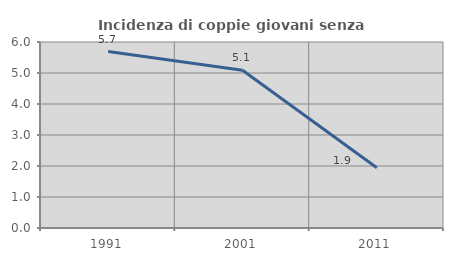
| Category | Incidenza di coppie giovani senza figli |
|---|---|
| 1991.0 | 5.691 |
| 2001.0 | 5.09 |
| 2011.0 | 1.943 |